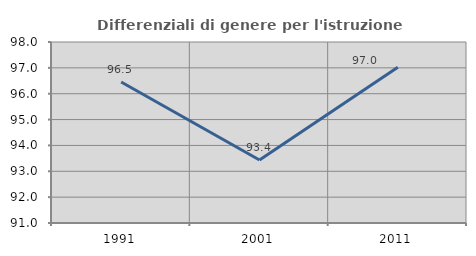
| Category | Differenziali di genere per l'istruzione superiore |
|---|---|
| 1991.0 | 96.454 |
| 2001.0 | 93.436 |
| 2011.0 | 97.026 |